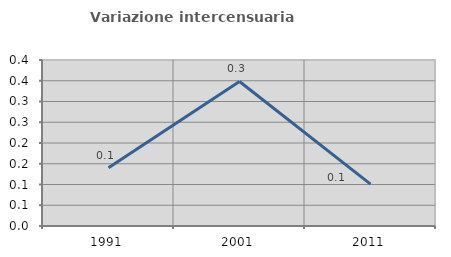
| Category | Variazione intercensuaria annua |
|---|---|
| 1991.0 | 0.14 |
| 2001.0 | 0.348 |
| 2011.0 | 0.101 |